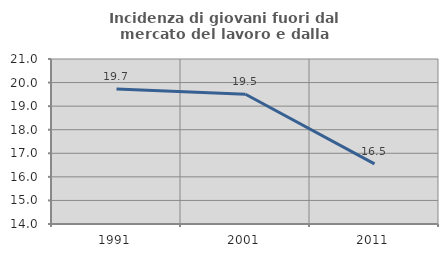
| Category | Incidenza di giovani fuori dal mercato del lavoro e dalla formazione  |
|---|---|
| 1991.0 | 19.726 |
| 2001.0 | 19.505 |
| 2011.0 | 16.548 |